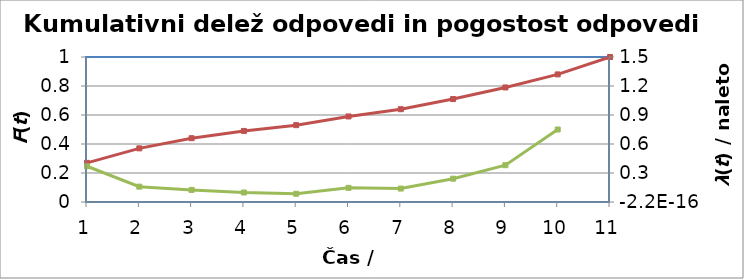
| Category | F(t) |
|---|---|
| 1.0 | 0.27 |
| 2.0 | 0.37 |
| 3.0 | 0.44 |
| 4.0 | 0.49 |
| 5.0 | 0.53 |
| 6.0 | 0.59 |
| 7.0 | 0.64 |
| 8.0 | 0.71 |
| 9.0 | 0.79 |
| 10.0 | 0.88 |
| 11.0 | 1 |